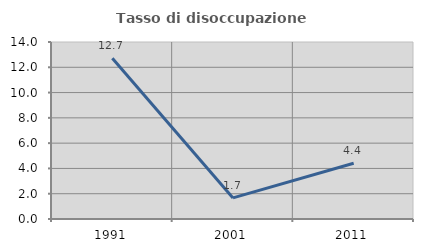
| Category | Tasso di disoccupazione giovanile  |
|---|---|
| 1991.0 | 12.712 |
| 2001.0 | 1.667 |
| 2011.0 | 4.412 |